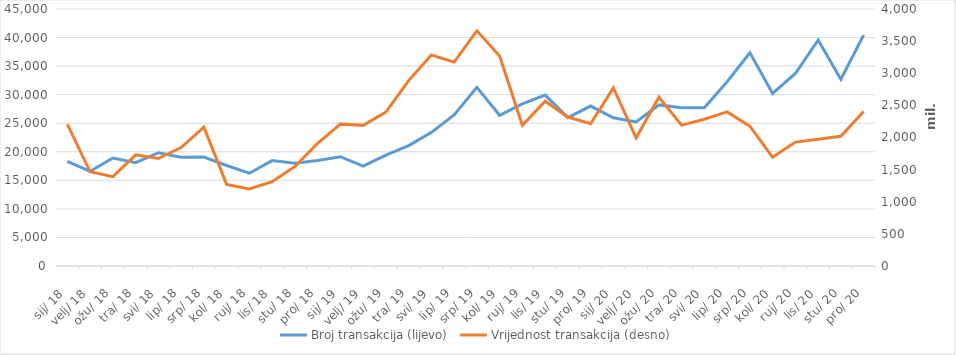
| Category | Broj transakcija (lijevo) |
|---|---|
| 2018-01-01 | 18326 |
| 2018-02-01 | 16563 |
| 2018-03-01 | 18898 |
| 2018-04-01 | 18098 |
| 2018-05-01 | 19833 |
| 2018-06-01 | 19036 |
| 2018-07-01 | 19065 |
| 2018-08-01 | 17603 |
| 2018-09-01 | 16246 |
| 2018-10-01 | 18456 |
| 2018-11-01 | 17981 |
| 2018-12-01 | 18471 |
| 2019-01-01 | 19140 |
| 2019-02-01 | 17474 |
| 2019-03-01 | 19425 |
| 2019-04-01 | 21071 |
| 2019-05-01 | 23391 |
| 2019-06-01 | 26460 |
| 2019-07-01 | 31286 |
| 2019-08-01 | 26386 |
| 2019-09-01 | 28373 |
| 2019-10-01 | 29930 |
| 2019-11-01 | 25974 |
| 2019-12-01 | 28005 |
| 2020-01-01 | 25951 |
| 2020-02-01 | 25225 |
| 2020-03-01 | 28202 |
| 2020-04-01 | 27722 |
| 2020-05-01 | 27719 |
| 2020-06-01 | 32261 |
| 2020-07-01 | 37342 |
| 2020-08-01 | 30214 |
| 2020-09-01 | 33709 |
| 2020-10-01 | 39562 |
| 2020-11-01 | 32690 |
| 2020-12-01 | 40436 |